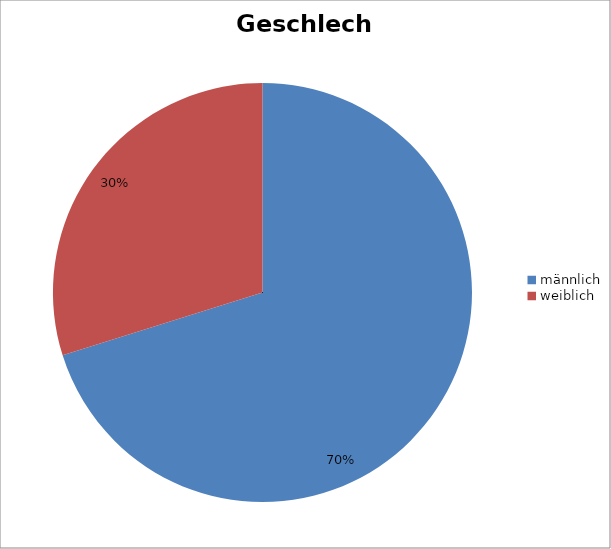
| Category | Series 0 |
|---|---|
| männlich | 11885 |
| weiblich | 5057 |